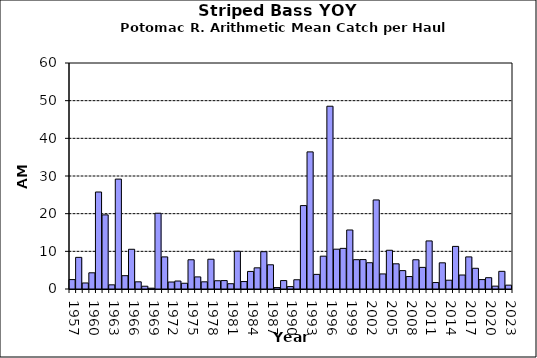
| Category | Series 0 |
|---|---|
| 1957.0 | 2.5 |
| 1958.0 | 8.4 |
| 1959.0 | 1.6 |
| 1960.0 | 4.3 |
| 1961.0 | 25.75 |
| 1962.0 | 19.679 |
| 1963.0 | 1.107 |
| 1964.0 | 29.179 |
| 1965.0 | 3.536 |
| 1966.0 | 10.548 |
| 1967.0 | 1.905 |
| 1968.0 | 0.738 |
| 1969.0 | 0.214 |
| 1970.0 | 20.119 |
| 1971.0 | 8.524 |
| 1972.0 | 1.857 |
| 1973.0 | 2.119 |
| 1974.0 | 1.524 |
| 1975.0 | 7.762 |
| 1976.0 | 3.214 |
| 1977.0 | 1.905 |
| 1978.0 | 7.905 |
| 1979.0 | 2.19 |
| 1980.0 | 2.238 |
| 1981.0 | 1.405 |
| 1982.0 | 10.024 |
| 1983.0 | 1.976 |
| 1984.0 | 4.667 |
| 1985.0 | 5.619 |
| 1986.0 | 9.905 |
| 1987.0 | 6.429 |
| 1988.0 | 0.381 |
| 1989.0 | 2.238 |
| 1990.0 | 0.643 |
| 1991.0 | 2.452 |
| 1992.0 | 22.143 |
| 1993.0 | 36.405 |
| 1994.0 | 3.881 |
| 1995.0 | 8.714 |
| 1996.0 | 48.524 |
| 1997.0 | 10.571 |
| 1998.0 | 10.786 |
| 1999.0 | 15.667 |
| 2000.0 | 7.786 |
| 2001.0 | 7.81 |
| 2002.0 | 6.976 |
| 2003.0 | 23.643 |
| 2004.0 | 4 |
| 2005.0 | 10.286 |
| 2006.0 | 6.69 |
| 2007.0 | 4.881 |
| 2008.0 | 3.31 |
| 2009.0 | 7.762 |
| 2010.0 | 5.738 |
| 2011.0 | 12.762 |
| 2012.0 | 1.714 |
| 2013.0 | 6.952 |
| 2014.0 | 2.333 |
| 2015.0 | 11.31 |
| 2016.0 | 3.714 |
| 2017.0 | 8.524 |
| 2018.0 | 5.5 |
| 2019.0 | 2.5 |
| 2020.0 | 3 |
| 2021.0 | 0.762 |
| 2022.0 | 4.69 |
| 2023.0 | 1.024 |